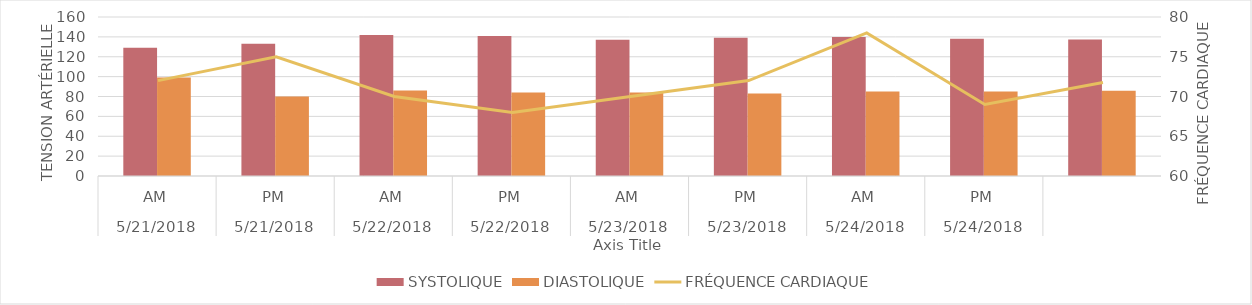
| Category | SYSTOLIQUE | DIASTOLIQUE |
|---|---|---|
| 0 | 129 | 99 |
| 1/1/00 | 133 | 80 |
| 1/2/00 | 142 | 86 |
| 1/3/00 | 141 | 84 |
| 1/4/00 | 137 | 84 |
| 1/5/00 | 139 | 83 |
| 1/6/00 | 140 | 85 |
| 1/7/00 | 138 | 85 |